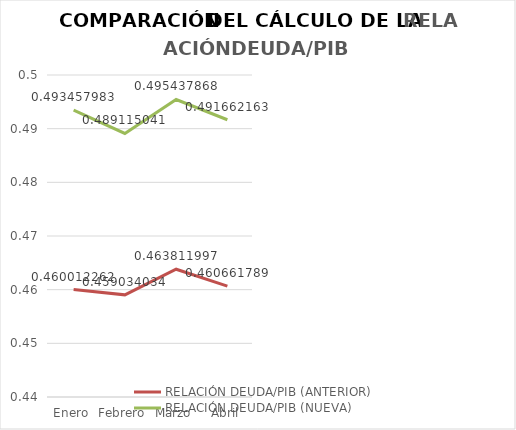
| Category | RELACIÓN DEUDA/PIB (ANTERIOR) | RELACIÓN DEUDA/PIB (NUEVA) |
|---|---|---|
| Enero | 0.46 | 0.493 |
| Febrero | 0.459 | 0.489 |
| Marzo | 0.464 | 0.495 |
| Abril | 0.461 | 0.492 |